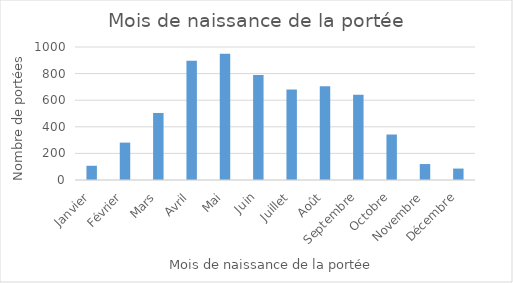
| Category | Series 0 |
|---|---|
| Janvier | 107 |
| Février | 281 |
| Mars | 504 |
| Avril | 896 |
| Mai | 949 |
| Juin | 790 |
| Juillet | 680 |
| Août | 705 |
| Septembre | 641 |
| Octobre | 342 |
| Novembre | 120 |
| Décembre | 86 |